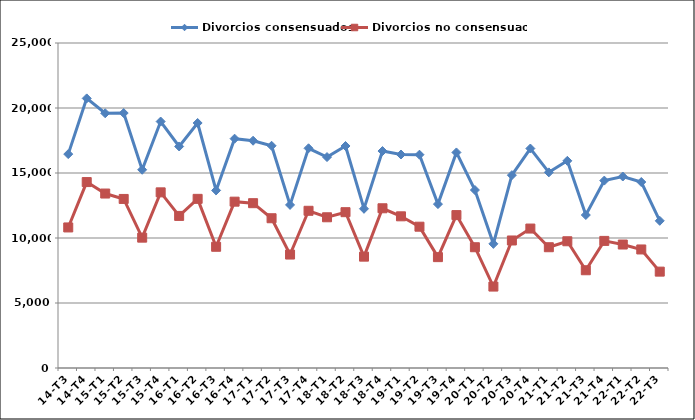
| Category | Divorcios consensuados | Divorcios no consensuados |
|---|---|---|
| 14-T3 | 16454 | 10812 |
| 14-T4 | 20739 | 14302 |
| 15-T1 | 19595 | 13420 |
| 15-T2 | 19612 | 13004 |
| 15-T3 | 15249 | 10027 |
| 15-T4 | 18958 | 13512 |
| 16-T1 | 17041 | 11699 |
| 16-T2 | 18847 | 13011 |
| 16-T3 | 13660 | 9325 |
| 16-T4 | 17641 | 12795 |
| 17-T1 | 17483 | 12679 |
| 17-T2 | 17095 | 11520 |
| 17-T3 | 12545 | 8727 |
| 17-T4 | 16901 | 12093 |
| 18-T1 | 16226 | 11594 |
| 18-T2 | 17077 | 11986 |
| 18-T3 | 12249 | 8566 |
| 18-T4 | 16689 | 12287 |
| 19-T1 | 16423 | 11668 |
| 19-T2 | 16409 | 10869 |
| 19-T3 | 12607 | 8528 |
| 19-T4 | 16581 | 11761 |
| 20-T1 | 13690 | 9290 |
| 20-T2 | 9552 | 6264 |
| 20-T3 | 14835 | 9809 |
| 20-T4 | 16883 | 10727 |
| 21-T1 | 15048 | 9290 |
| 21-T2 | 15937 | 9750 |
| 21-T3 | 11767 | 7520 |
| 21-T4 | 14416 | 9777 |
| 22-T1 | 14730 | 9498 |
| 22-T2 | 14306 | 9118 |
| 22-T3 | 11321 | 7413 |